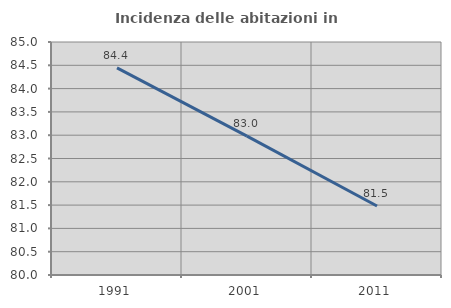
| Category | Incidenza delle abitazioni in proprietà  |
|---|---|
| 1991.0 | 84.444 |
| 2001.0 | 82.979 |
| 2011.0 | 81.481 |